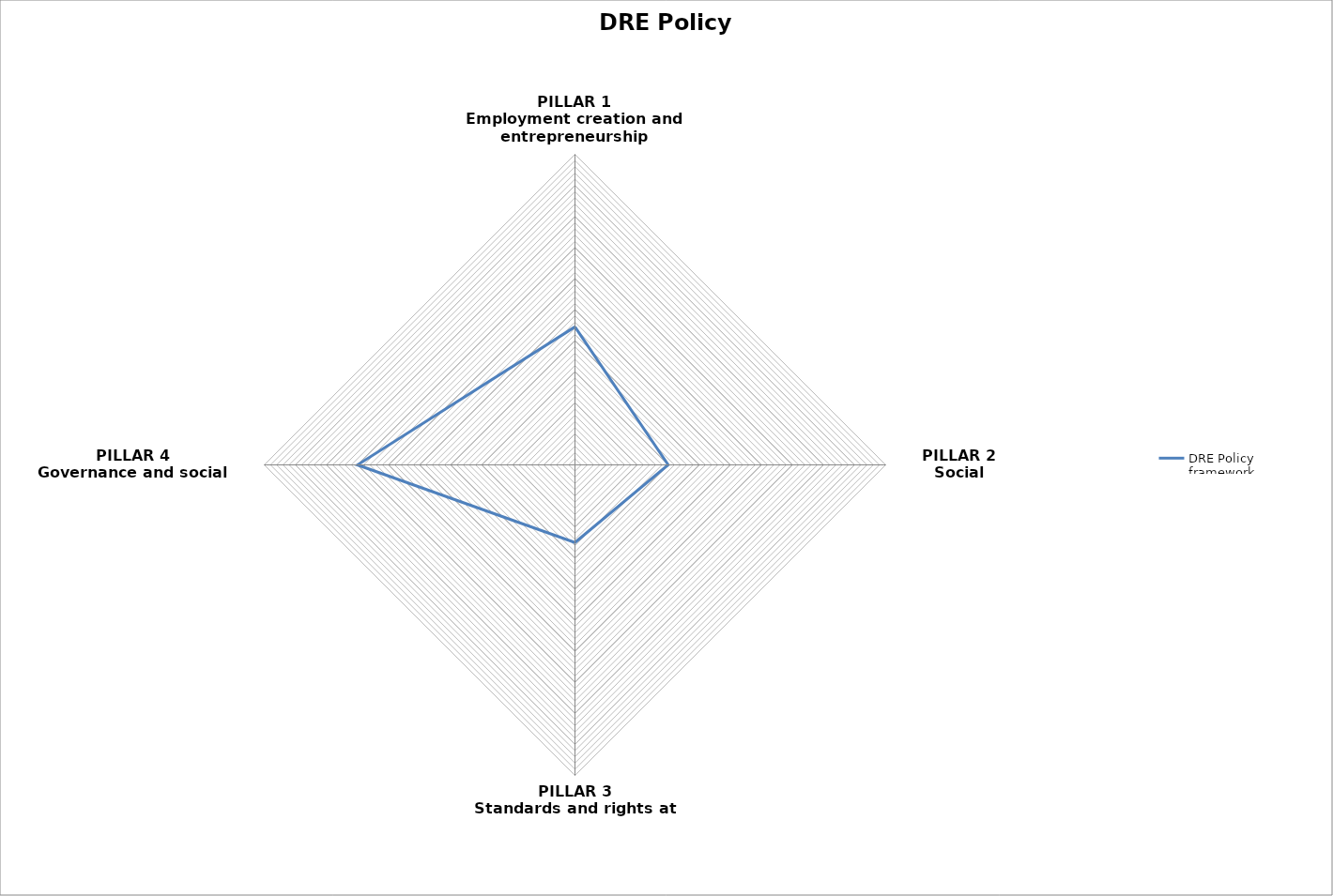
| Category | DRE Policy framework |
|---|---|
| PILLAR 1
Employment creation and entrepreneurship development | 0.444 |
| PILLAR 2
Social protection | 0.3 |
| PILLAR 3
Standards and rights at work | 0.25 |
| PILLAR 4
Governance and social dialogue | 0.7 |